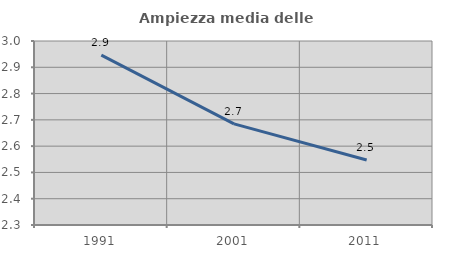
| Category | Ampiezza media delle famiglie |
|---|---|
| 1991.0 | 2.946 |
| 2001.0 | 2.685 |
| 2011.0 | 2.547 |